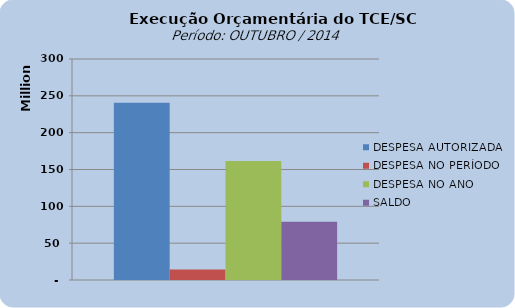
| Category | DESPESA AUTORIZADA | DESPESA NO PERÍODO | DESPESA NO ANO | SALDO |
|---|---|---|---|---|
| 0 | 240766115.02 | 14176800.63 | 161688502.04 | 79077612.98 |